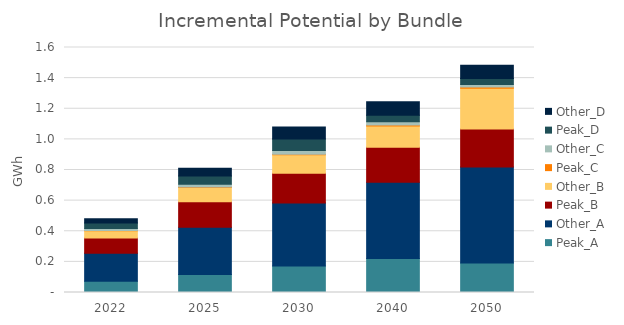
| Category | Peak_A | Other_A | Peak_B | Other_B | Peak_C | Other_C | Peak_D | Other_D |
|---|---|---|---|---|---|---|---|---|
| 2022.0 | 0.074 | 0.183 | 0.099 | 0.047 | 0.002 | 0.013 | 0.035 | 0.029 |
| 2025.0 | 0.118 | 0.309 | 0.166 | 0.092 | 0.003 | 0.019 | 0.054 | 0.05 |
| 2030.0 | 0.173 | 0.411 | 0.194 | 0.121 | 0.004 | 0.024 | 0.075 | 0.078 |
| 2040.0 | 0.222 | 0.499 | 0.228 | 0.139 | 0.007 | 0.021 | 0.042 | 0.087 |
| 2050.0 | 0.193 | 0.628 | 0.247 | 0.266 | 0.009 | 0.015 | 0.04 | 0.086 |